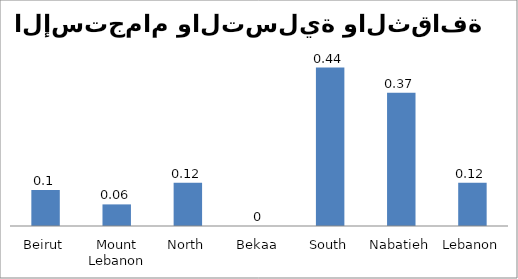
| Category | Series 0 |
|---|---|
| Beirut | 0.1 |
| Mount Lebanon | 0.06 |
| North | 0.12 |
| Bekaa | 0 |
| South | 0.44 |
| Nabatieh | 0.37 |
| Lebanon | 0.12 |